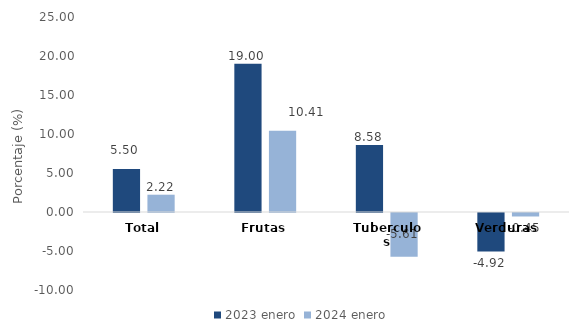
| Category | 2023 | 2024 |
|---|---|---|
| Total | 5.503 | 2.217 |
| Frutas | 18.999 | 10.408 |
| Tuberculos | 8.58 | -5.612 |
| Verduras | -4.92 | -0.447 |